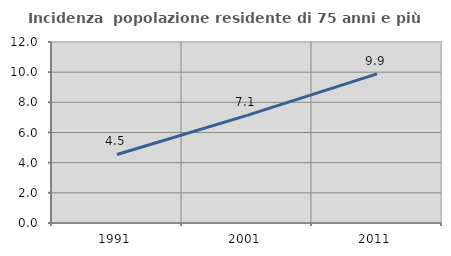
| Category | Incidenza  popolazione residente di 75 anni e più |
|---|---|
| 1991.0 | 4.544 |
| 2001.0 | 7.137 |
| 2011.0 | 9.889 |